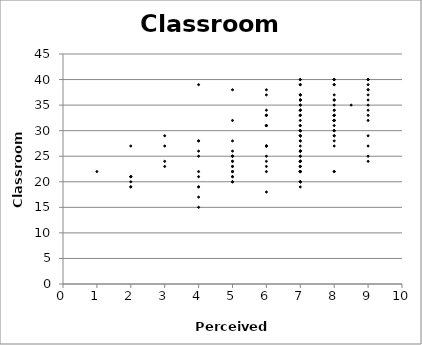
| Category | c_community (y) |
|---|---|
| 7.0 | 23 |
| 7.0 | 22 |
| 5.0 | 23 |
| 7.0 | 23 |
| 5.0 | 22 |
| 8.0 | 32 |
| 7.0 | 24 |
| 6.0 | 22 |
| 5.0 | 28 |
| 5.0 | 25 |
| 7.0 | 22 |
| 6.0 | 23 |
| 9.0 | 33 |
| 2.0 | 19 |
| 5.0 | 38 |
| 6.0 | 27 |
| 7.0 | 19 |
| 7.0 | 24 |
| 4.0 | 15 |
| 7.0 | 32 |
| 7.0 | 26 |
| 7.0 | 20 |
| 5.0 | 24 |
| 7.0 | 29 |
| 3.0 | 23 |
| 8.0 | 32 |
| 8.0 | 22 |
| 8.0 | 36 |
| 6.0 | 18 |
| 4.0 | 26 |
| 5.0 | 22 |
| 5.0 | 25 |
| 2.0 | 27 |
| 5.0 | 26 |
| 9.0 | 34 |
| 8.0 | 33 |
| 9.0 | 35 |
| 8.0 | 27 |
| 7.0 | 29 |
| 2.0 | 20 |
| 7.0 | 28 |
| 4.0 | 19 |
| 4.0 | 25 |
| 6.0 | 27 |
| 8.0 | 37 |
| 6.0 | 24 |
| 4.0 | 28 |
| 6.0 | 31 |
| 8.0 | 32 |
| 5.0 | 21 |
| 7.0 | 29 |
| 8.0 | 35 |
| 3.0 | 27 |
| 8.0 | 29 |
| 8.0 | 30 |
| 7.0 | 26 |
| 7.0 | 26 |
| 7.0 | 26 |
| 7.0 | 30 |
| 7.0 | 22 |
| 7.0 | 31 |
| 4.0 | 21 |
| 8.0 | 40 |
| 8.0 | 32 |
| 8.0 | 39 |
| 8.0 | 30 |
| 7.0 | 22 |
| 7.0 | 30 |
| 5.0 | 20 |
| 7.0 | 23 |
| 6.0 | 33 |
| 2.0 | 21 |
| 5.0 | 32 |
| 7.0 | 24 |
| 5.0 | 20 |
| 7.0 | 24 |
| 7.0 | 29 |
| 7.0 | 27 |
| 5.0 | 25 |
| 3.0 | 24 |
| 7.0 | 33 |
| 6.0 | 25 |
| 7.0 | 24 |
| 7.0 | 34 |
| 7.0 | 30 |
| 7.0 | 36 |
| 6.0 | 27 |
| 8.0 | 34 |
| 8.0 | 29 |
| 7.0 | 37 |
| 9.0 | 39 |
| 8.0 | 33 |
| 7.0 | 28 |
| 9.0 | 38 |
| 8.0 | 40 |
| 9.0 | 27 |
| 7.0 | 29 |
| 9.0 | 37 |
| 9.0 | 40 |
| 8.0 | 36 |
| 8.5 | 35 |
| 7.0 | 39 |
| 6.0 | 33 |
| 9.0 | 24 |
| 3.0 | 29 |
| 8.0 | 32 |
| 7.0 | 37 |
| 6.0 | 31 |
| 4.0 | 17 |
| 5.0 | 23 |
| 7.0 | 20 |
| 8.0 | 22 |
| 5.0 | 24 |
| 7.0 | 20 |
| 9.0 | 29 |
| 7.0 | 36 |
| 4.0 | 28 |
| 8.0 | 36 |
| 7.0 | 22 |
| 7.0 | 26 |
| 7.0 | 31 |
| 6.0 | 38 |
| 7.0 | 36 |
| 7.0 | 37 |
| 7.0 | 34 |
| 8.0 | 34 |
| 7.0 | 35 |
| 7.0 | 39 |
| 8.0 | 33 |
| 7.0 | 40 |
| 6.0 | 37 |
| 4.0 | 19 |
| 9.0 | 38 |
| 7.0 | 36 |
| 7.0 | 40 |
| 9.0 | 40 |
| 7.0 | 34 |
| 8.0 | 33 |
| 7.0 | 30 |
| 6.0 | 27 |
| 8.0 | 28 |
| 9.0 | 32 |
| 1.0 | 22 |
| 9.0 | 36 |
| 5.0 | 21 |
| 9.0 | 25 |
| 6.0 | 34 |
| 7.0 | 25 |
| 7.0 | 20 |
| 7.0 | 34 |
| 7.0 | 22 |
| 5.0 | 22 |
| 7.0 | 30 |
| 8.0 | 31 |
| 2.0 | 19 |
| 6.0 | 31 |
| 7.0 | 25 |
| 4.0 | 22 |
| 8.0 | 30 |
| 2.0 | 21 |
| 7.0 | 35 |
| 8.0 | 40 |
| 7.0 | 33 |
| 4.0 | 39 |
| 8.0 | 39 |
| 7.0 | 33 |
| 6.0 | 33 |
| 2.0 | 21 |